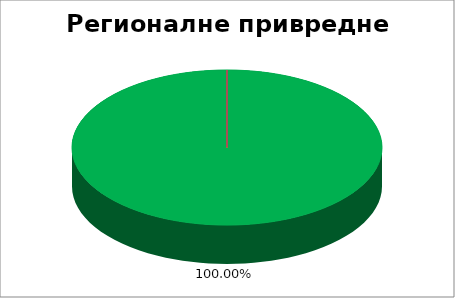
| Category | Регионалне привредне коморе |
|---|---|
| 0 | 1 |
| 1 | 0 |
| 2 | 0 |
| 3 | 0 |
| 4 | 0 |